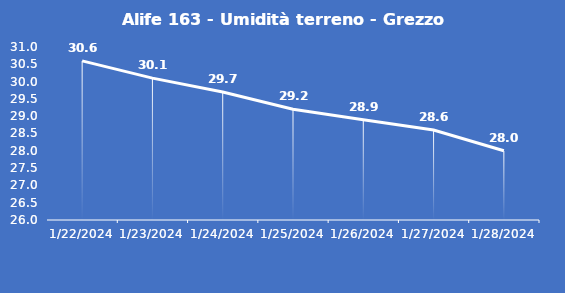
| Category | Alife 163 - Umidità terreno - Grezzo (%VWC) |
|---|---|
| 1/22/24 | 30.6 |
| 1/23/24 | 30.1 |
| 1/24/24 | 29.7 |
| 1/25/24 | 29.2 |
| 1/26/24 | 28.9 |
| 1/27/24 | 28.6 |
| 1/28/24 | 28 |